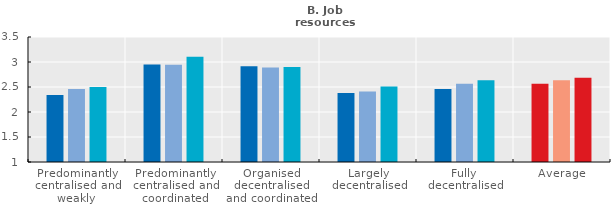
| Category | 2005 | 2010 | 2015 |
|---|---|---|---|
| Predominantly centralised and weakly co-ordinated | 2.34 | 2.461 | 2.501 |
| Predominantly centralised and coordinated | 2.95 | 2.943 | 3.106 |
| Organised decentralised and coordinated | 2.916 | 2.888 | 2.9 |
| Largely decentralised | 2.381 | 2.411 | 2.509 |
| Fully decentralised | 2.458 | 2.564 | 2.634 |
| Average | 2.566 | 2.633 | 2.687 |